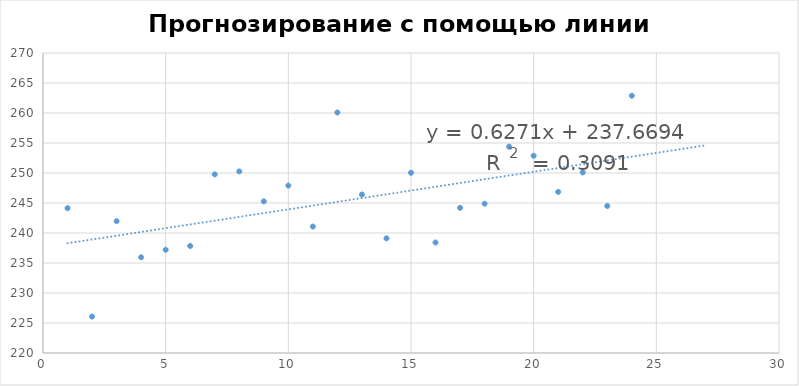
| Category | Series 0 |
|---|---|
| 0 | 244.14 |
| 1 | 226.072 |
| 2 | 241.975 |
| 3 | 235.959 |
| 4 | 237.204 |
| 5 | 237.84 |
| 6 | 249.771 |
| 7 | 250.261 |
| 8 | 245.27 |
| 9 | 247.907 |
| 10 | 241.074 |
| 11 | 260.083 |
| 12 | 246.414 |
| 13 | 239.11 |
| 14 | 250.035 |
| 15 | 238.414 |
| 16 | 244.189 |
| 17 | 244.881 |
| 18 | 254.382 |
| 19 | 252.875 |
| 20 | 246.851 |
| 21 | 250.091 |
| 22 | 244.509 |
| 23 | 262.878 |